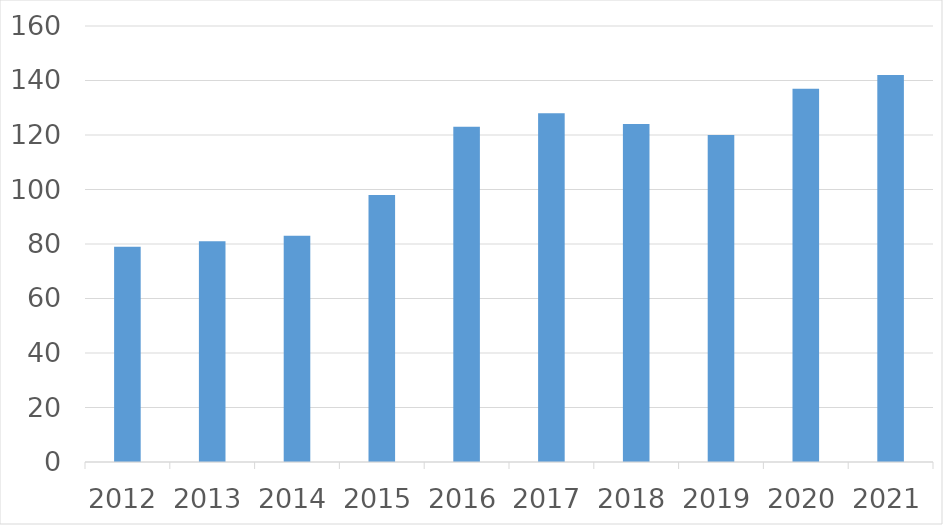
| Category | Series 0 |
|---|---|
| 2012 | 79 |
| 2013 | 81 |
| 2014 | 83 |
| 2015 | 98 |
| 2016 | 123 |
| 2017 | 128 |
| 2018 | 124 |
| 2019 | 120 |
| 2020 | 137 |
| 2021 | 142 |